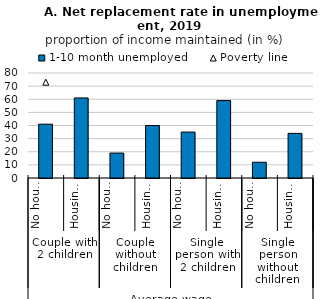
| Category | 1-10 month unemployed |
|---|---|
| 0 | 41 |
| 1 | 61 |
| 2 | 19 |
| 3 | 40 |
| 4 | 35 |
| 5 | 59 |
| 6 | 12 |
| 7 | 34 |